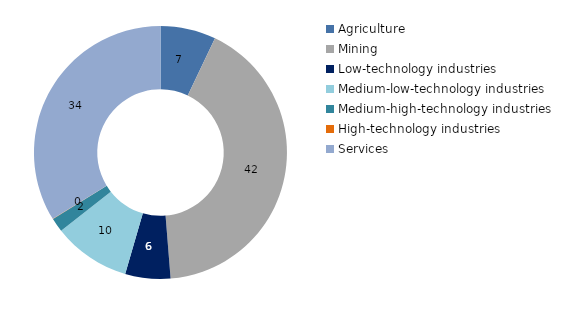
| Category | 2014 |
|---|---|
| Agriculture | 7.091 |
| Mining | 41.637 |
| Low-technology industries | 5.779 |
| Medium-low-technology industries | 9.876 |
| Medium-high-technology industries | 1.795 |
| High-technology industries | 0.042 |
| Services | 33.78 |